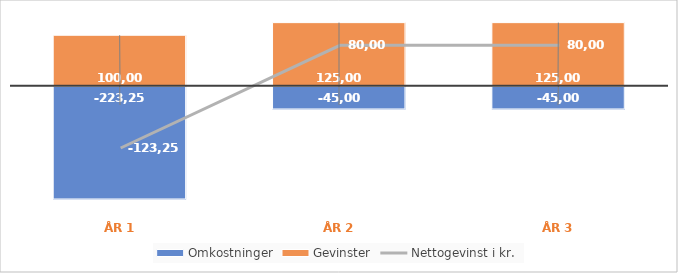
| Category | Omkostninger | Gevinster |
|---|---|---|
| År 1 | -223250 | 100000 |
| År 2 | -45000 | 125000 |
| År 3 | -45000 | 125000 |